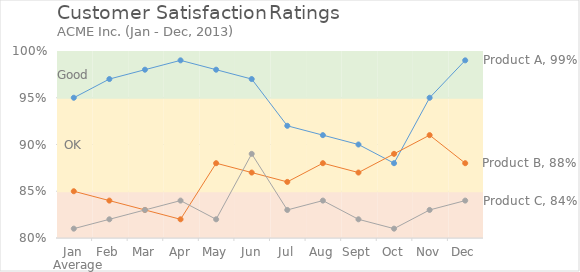
| Category | Average | OK | Good |
|---|---|---|---|
| 2013-01-01 | 0.85 | 0.1 | 0.05 |
| 2013-02-01 | 0.85 | 0.1 | 0.05 |
| 2013-03-01 | 0.85 | 0.1 | 0.05 |
| 2013-04-01 | 0.85 | 0.1 | 0.05 |
| 2013-05-01 | 0.85 | 0.1 | 0.05 |
| 2013-06-01 | 0.85 | 0.1 | 0.05 |
| 2013-07-01 | 0.85 | 0.1 | 0.05 |
| 2013-08-01 | 0.85 | 0.1 | 0.05 |
| 2013-09-01 | 0.85 | 0.1 | 0.05 |
| 2013-10-01 | 0.85 | 0.1 | 0.05 |
| 2013-11-01 | 0.85 | 0.1 | 0.05 |
| 2013-12-01 | 0.85 | 0.1 | 0.05 |